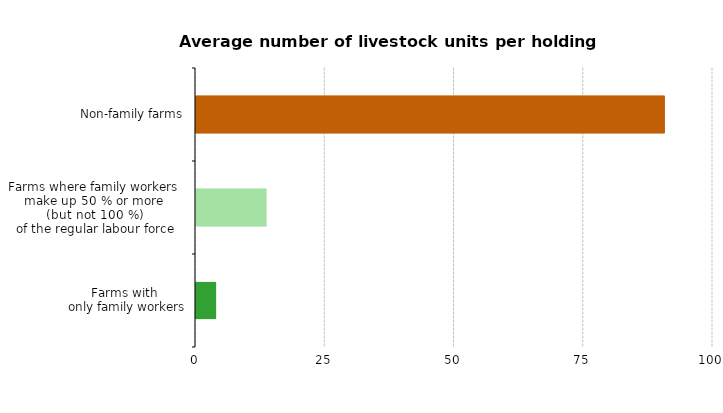
| Category | Average number of livestock per holding |
|---|---|
| Farms with 
only family workers | 3.898 |
| Farms where family workers 
make up 50 % or more 
(but not 100 %) 
of the regular labour force | 13.556 |
| Non-family farms | 90.6 |